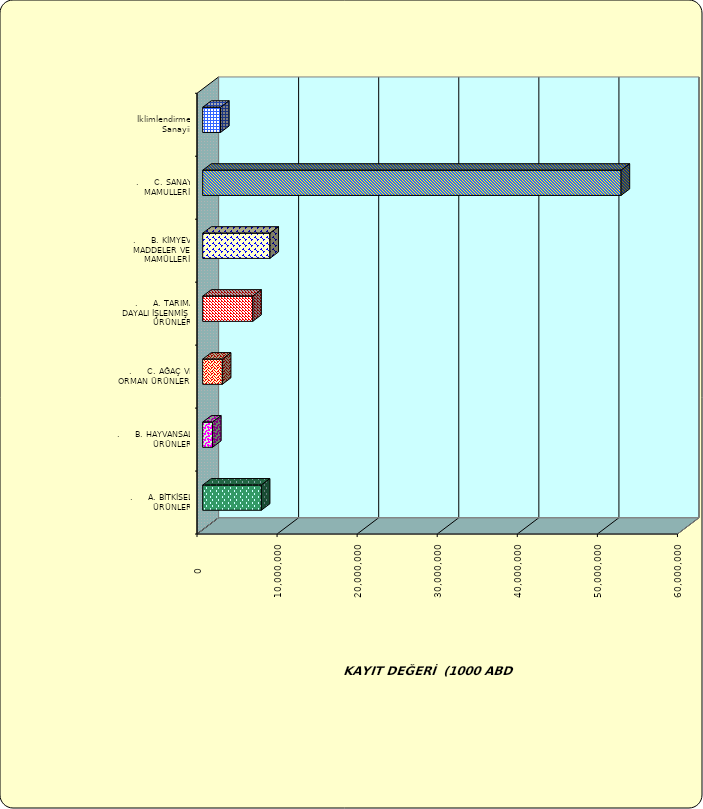
| Category | Series 0 |
|---|---|
| .     A. BİTKİSEL ÜRÜNLER | 7320952.39 |
| .     B. HAYVANSAL ÜRÜNLER | 1231675.564 |
| .     C. AĞAÇ VE ORMAN ÜRÜNLERİ | 2452943.299 |
| .     A. TARIMA DAYALI İŞLENMİŞ ÜRÜNLER | 6252097.029 |
| .     B. KİMYEVİ MADDELER VE MAMÜLLERİ | 8396826.213 |
| .     C. SANAYİ MAMULLERİ | 52248644.065 |
|  İklimlendirme Sanayii | 2231162.239 |